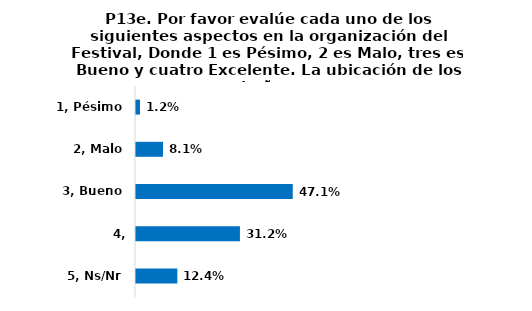
| Category | Series 0 |
|---|---|
| 1, Pésimo | 0.012 |
| 2, Malo | 0.081 |
| 3, Bueno | 0.471 |
| 4, Excelente | 0.312 |
| 5, Ns/Nr | 0.124 |